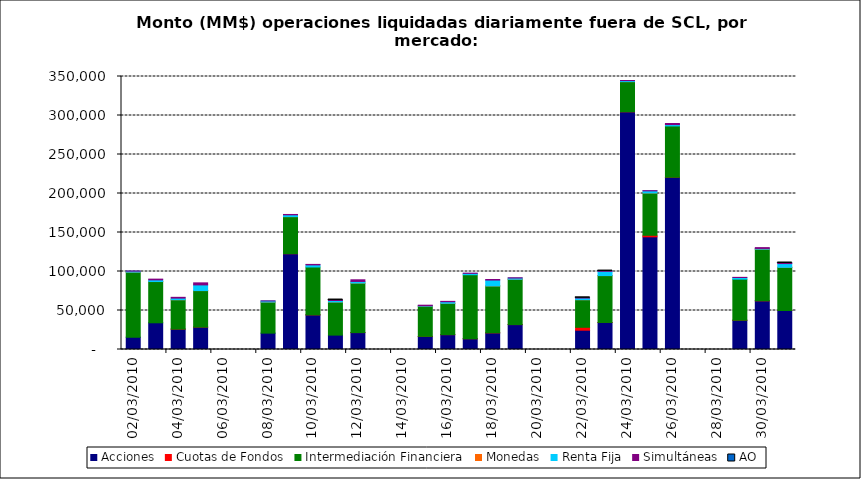
| Category | Acciones | Cuotas de Fondos | Intermediación Financiera | Monedas | Renta Fija | Simultáneas | AO |
|---|---|---|---|---|---|---|---|
| 02/03/2010 | 15798.153 | 0 | 83373.312 | 3 | 1297.869 | 180.781 | 0 |
| 03/03/2010 | 34243.459 | 0 | 52890.525 | 0.375 | 2141.977 | 940.664 | 0 |
| 04/03/2010 | 26160.726 | 14.304 | 37620.465 | 11.999 | 2101.428 | 979.343 | 0 |
| 05/03/2010 | 28727.653 | 0.002 | 46800.449 | 17.625 | 7280.992 | 2608.524 | 0 |
| 08/03/2010 | 20991.601 | 0 | 39848.326 | 0.373 | 1436.35 | 50.558 | 0 |
| 09/03/2010 | 122803.826 | 74.376 | 47472.212 | 3.75 | 2330.552 | 435.88 | 0 |
| 10/03/2010 | 44415.667 | 0.001 | 61372.562 | 0 | 2699.011 | 604.243 | 0 |
| 11/03/2010 | 18456.358 | 0 | 42419.907 | 8.69 | 1957.994 | 573.916 | 0.054 |
| 12/03/2010 | 21689.773 | 15.125 | 63499.886 | 3.6 | 2040.111 | 2121.123 | 0 |
| 15/03/2010 | 16629.992 | 202.368 | 38732.406 | 0.36 | 600.418 | 636.011 | 0 |
| 16/03/2010 | 19034.887 | 45.44 | 40138.213 | 33.48 | 1995.617 | 458.867 | 0 |
| 17/03/2010 | 13831.825 | 38.661 | 81989.819 | 0 | 1735.628 | 261.535 | 0 |
| 18/03/2010 | 21310.875 | 98.614 | 60093.301 | 4.43 | 7506.465 | 751.017 | 0 |
| 19/03/2010 | 31935.511 | 36.109 | 58101.439 | 1.84 | 1579.687 | 312.143 | 0 |
| 22/03/2010 | 24734.065 | 3745.861 | 35352.944 | 12.912 | 2144.466 | 239.383 | 0.05 |
| 23/03/2010 | 34634.622 | 32.399 | 60105.076 | 1.8 | 5472.224 | 307.697 | 0.309 |
| 24/03/2010 | 304745.568 | 73.319 | 38602.566 | 24.834 | 1260.583 | 143.319 | 0 |
| 25/03/2010 | 144456.904 | 1984.508 | 54230.914 | 1.8 | 2711.504 | 262.034 | 0 |
| 26/03/2010 | 220744.297 | 80.369 | 65794.332 | 0 | 1742.848 | 1404.683 | 0 |
| 29/03/2010 | 37520.57 | 0 | 52698.545 | 0 | 2109.59 | 162.884 | 0 |
| 30/03/2010 | 62395.93 | 80.916 | 66183.255 | 6.783 | 905.66 | 1055.701 | 0 |
| 31/03/2010 | 50000.1 | 10.251 | 55335.102 | 8.925 | 4814.638 | 725.427 | 0.012 |